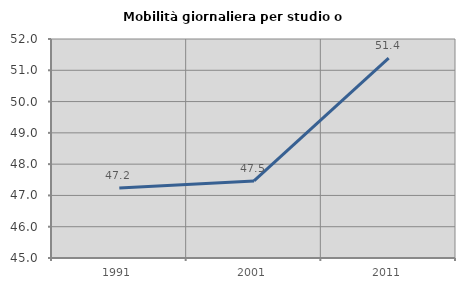
| Category | Mobilità giornaliera per studio o lavoro |
|---|---|
| 1991.0 | 47.237 |
| 2001.0 | 47.464 |
| 2011.0 | 51.391 |